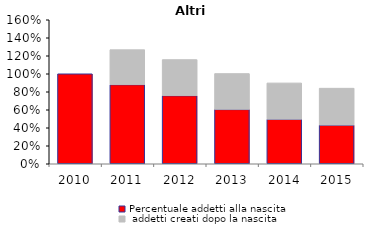
| Category | Percentuale addetti alla nascita | Percentuale addetti creati dopo la nascita |
|---|---|---|
| 2010.0 | 1 | 0 |
| 2011.0 | 0.88 | 0.388 |
| 2012.0 | 0.758 | 0.4 |
| 2013.0 | 0.604 | 0.399 |
| 2014.0 | 0.496 | 0.403 |
| 2015.0 | 0.43 | 0.41 |